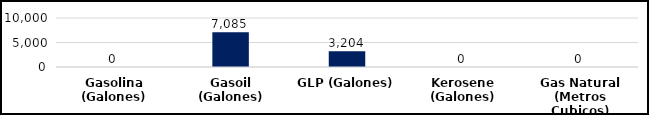
| Category | Series 0 |
|---|---|
| Gasolina (Galones) | 0 |
| Gasoil (Galones) | 7085 |
| GLP (Galones) | 3204 |
| Kerosene (Galones) | 0 |
| Gas Natural (Metros Cubicos) | 0 |